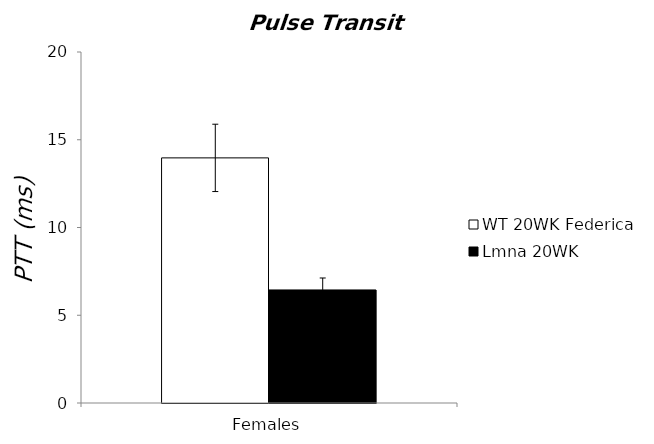
| Category | WT 20WK Federica | Lmna 20WK |
|---|---|---|
| 0 | 13.967 | 6.442 |